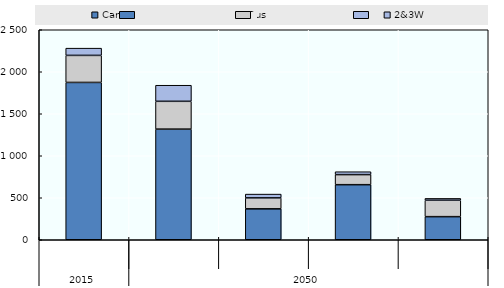
| Category | Car | Bus | 2&3W |
|---|---|---|---|
| 0 | 1872.78 | 322.083 | 86.069 |
| 1 | 1317.132 | 331.014 | 191.34 |
| 2 | 368.038 | 130.382 | 45.128 |
| 3 | 655.602 | 119.948 | 34.509 |
| 4 | 274.991 | 195.485 | 21.858 |